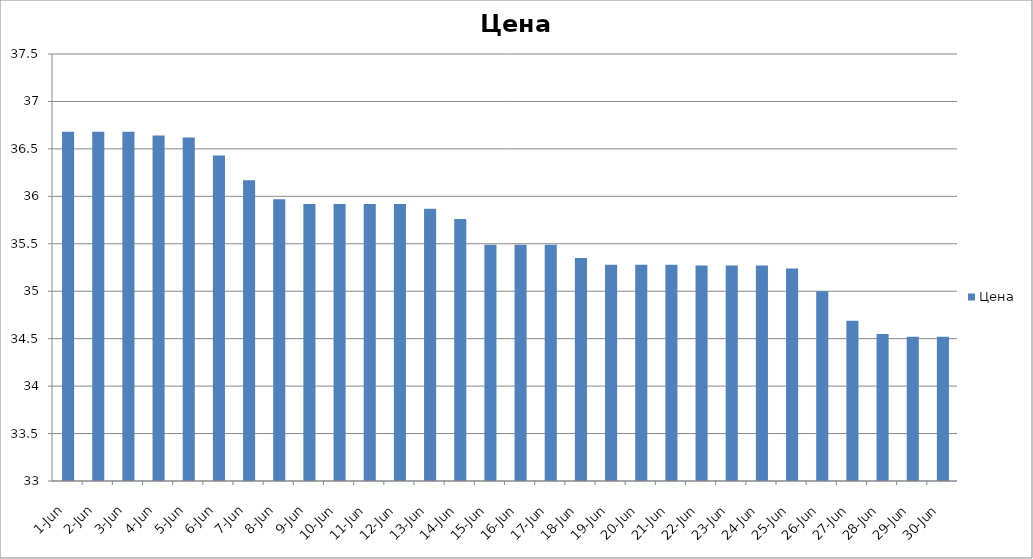
| Category | Цена |
|---|---|
| 2018-06-01 | 36.68 |
| 2018-06-02 | 36.68 |
| 2018-06-03 | 36.68 |
| 2018-06-04 | 36.64 |
| 2018-06-05 | 36.62 |
| 2018-06-06 | 36.43 |
| 2018-06-07 | 36.17 |
| 2018-06-08 | 35.97 |
| 2018-06-09 | 35.92 |
| 2018-06-10 | 35.92 |
| 2018-06-11 | 35.92 |
| 2018-06-12 | 35.92 |
| 2018-06-13 | 35.87 |
| 2018-06-14 | 35.76 |
| 2018-06-15 | 35.49 |
| 2018-06-16 | 35.49 |
| 2018-06-17 | 35.49 |
| 2018-06-18 | 35.35 |
| 2018-06-19 | 35.28 |
| 2018-06-20 | 35.28 |
| 2018-06-21 | 35.28 |
| 2018-06-22 | 35.27 |
| 2018-06-23 | 35.27 |
| 2018-06-24 | 35.27 |
| 2018-06-25 | 35.24 |
| 2018-06-26 | 35 |
| 2018-06-27 | 34.69 |
| 2018-06-28 | 34.55 |
| 2018-06-29 | 34.52 |
| 2018-06-30 | 34.52 |